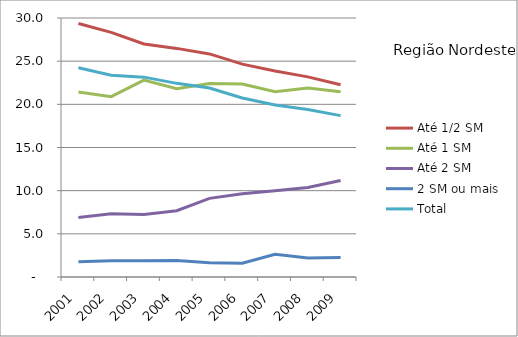
| Category | Até 1/2 SM | Até 1 SM | Até 2 SM | 2 SM ou mais | Total |
|---|---|---|---|---|---|
| 2001.0 | 29.36 | 21.42 | 6.88 | 1.77 | 24.24 |
| 2002.0 | 28.33 | 20.89 | 7.33 | 1.87 | 23.36 |
| 2003.0 | 26.99 | 22.81 | 7.23 | 1.88 | 23.15 |
| 2004.0 | 26.48 | 21.8 | 7.68 | 1.92 | 22.43 |
| 2005.0 | 25.84 | 22.4 | 9.11 | 1.64 | 21.89 |
| 2006.0 | 24.66 | 22.36 | 9.64 | 1.59 | 20.73 |
| 2007.0 | 23.86 | 21.46 | 9.98 | 2.63 | 19.93 |
| 2008.0 | 23.18 | 21.89 | 10.36 | 2.2 | 19.41 |
| 2009.0 | 22.26 | 21.47 | 11.17 | 2.25 | 18.69 |